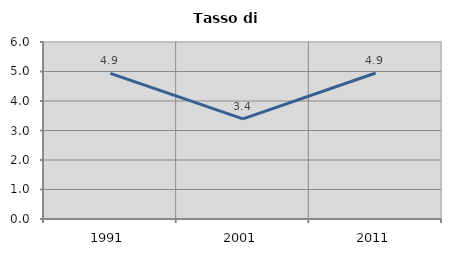
| Category | Tasso di disoccupazione   |
|---|---|
| 1991.0 | 4.938 |
| 2001.0 | 3.396 |
| 2011.0 | 4.949 |